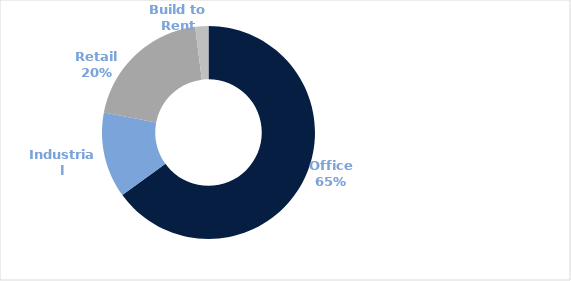
| Category | Series 0 |
|---|---|
| Office | 0.65 |
| Industrial | 0.13 |
| Retail | 0.2 |
| Build to Rent | 0.02 |